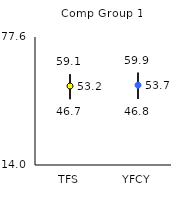
| Category | 25th | 75th | Mean |
|---|---|---|---|
| TFS | 46.7 | 59.1 | 53.23 |
| YFCY | 46.8 | 59.9 | 53.67 |